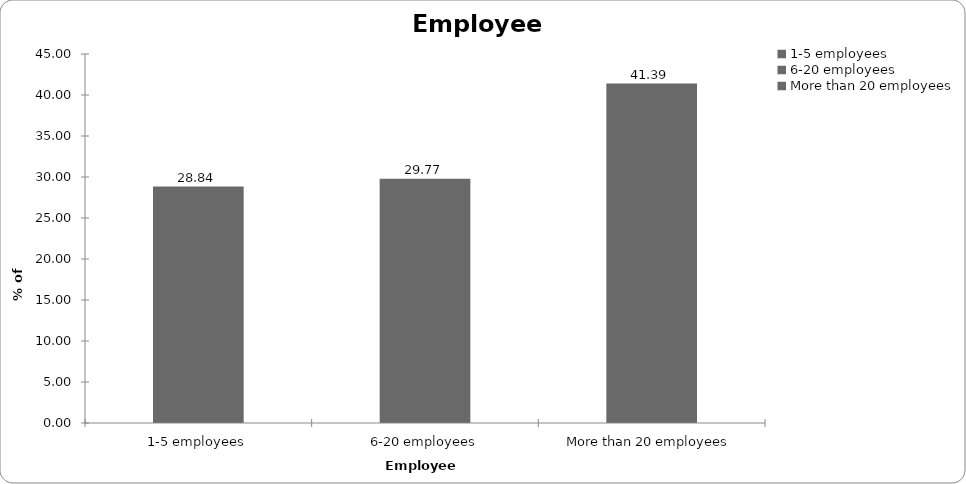
| Category | Employees |
|---|---|
| 1-5 employees | 28.838 |
| 6-20 employees | 29.773 |
| More than 20 employees | 41.389 |